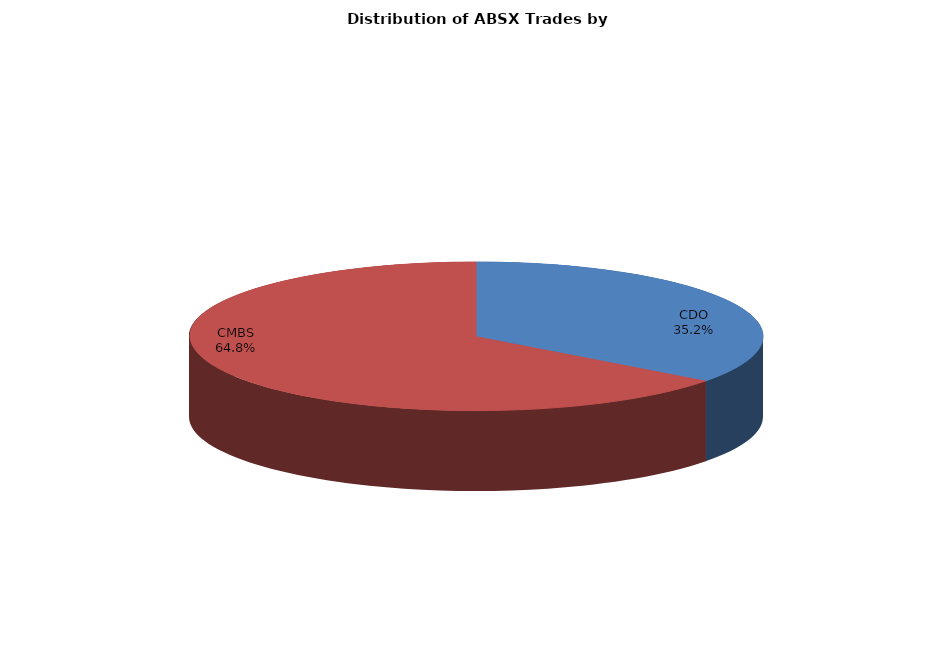
| Category | Series 0 |
|---|---|
| CDO | 114.81 |
| CMBS | 211.052 |